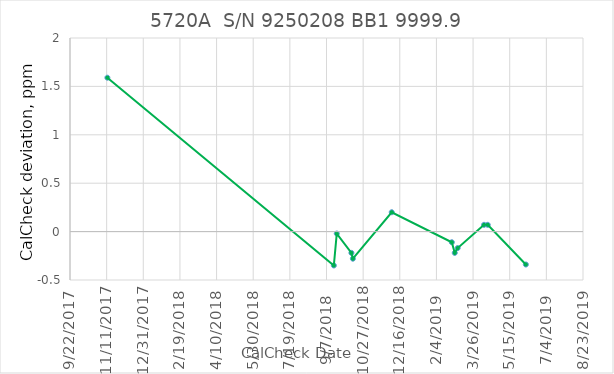
| Category | Series 0 |
|---|---|
| 43051.0 | 1.59 |
| 43360.0 | -0.35 |
| 43364.0 | -0.02 |
| 43384.0 | -0.22 |
| 43386.0 | -0.28 |
| 43439.0 | 0.2 |
| 43521.0 | -0.11 |
| 43525.0 | -0.22 |
| 43529.0 | -0.17 |
| 43565.0 | 0.07 |
| 43570.0 | 0.07 |
| 43622.0 | -0.34 |